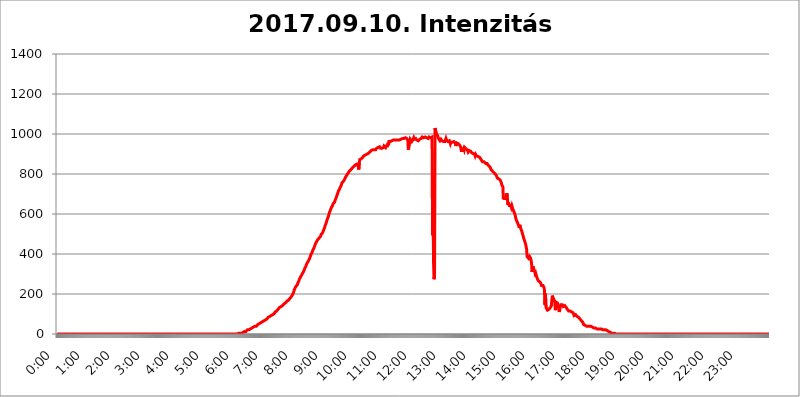
| Category | 2017.09.10. Intenzitás [W/m^2] |
|---|---|
| 0.0 | 0 |
| 0.0006944444444444445 | 0 |
| 0.001388888888888889 | 0 |
| 0.0020833333333333333 | 0 |
| 0.002777777777777778 | 0 |
| 0.003472222222222222 | 0 |
| 0.004166666666666667 | 0 |
| 0.004861111111111111 | 0 |
| 0.005555555555555556 | 0 |
| 0.0062499999999999995 | 0 |
| 0.006944444444444444 | 0 |
| 0.007638888888888889 | 0 |
| 0.008333333333333333 | 0 |
| 0.009027777777777779 | 0 |
| 0.009722222222222222 | 0 |
| 0.010416666666666666 | 0 |
| 0.011111111111111112 | 0 |
| 0.011805555555555555 | 0 |
| 0.012499999999999999 | 0 |
| 0.013194444444444444 | 0 |
| 0.013888888888888888 | 0 |
| 0.014583333333333332 | 0 |
| 0.015277777777777777 | 0 |
| 0.015972222222222224 | 0 |
| 0.016666666666666666 | 0 |
| 0.017361111111111112 | 0 |
| 0.018055555555555557 | 0 |
| 0.01875 | 0 |
| 0.019444444444444445 | 0 |
| 0.02013888888888889 | 0 |
| 0.020833333333333332 | 0 |
| 0.02152777777777778 | 0 |
| 0.022222222222222223 | 0 |
| 0.02291666666666667 | 0 |
| 0.02361111111111111 | 0 |
| 0.024305555555555556 | 0 |
| 0.024999999999999998 | 0 |
| 0.025694444444444447 | 0 |
| 0.02638888888888889 | 0 |
| 0.027083333333333334 | 0 |
| 0.027777777777777776 | 0 |
| 0.02847222222222222 | 0 |
| 0.029166666666666664 | 0 |
| 0.029861111111111113 | 0 |
| 0.030555555555555555 | 0 |
| 0.03125 | 0 |
| 0.03194444444444445 | 0 |
| 0.03263888888888889 | 0 |
| 0.03333333333333333 | 0 |
| 0.034027777777777775 | 0 |
| 0.034722222222222224 | 0 |
| 0.035416666666666666 | 0 |
| 0.036111111111111115 | 0 |
| 0.03680555555555556 | 0 |
| 0.0375 | 0 |
| 0.03819444444444444 | 0 |
| 0.03888888888888889 | 0 |
| 0.03958333333333333 | 0 |
| 0.04027777777777778 | 0 |
| 0.04097222222222222 | 0 |
| 0.041666666666666664 | 0 |
| 0.042361111111111106 | 0 |
| 0.04305555555555556 | 0 |
| 0.043750000000000004 | 0 |
| 0.044444444444444446 | 0 |
| 0.04513888888888889 | 0 |
| 0.04583333333333334 | 0 |
| 0.04652777777777778 | 0 |
| 0.04722222222222222 | 0 |
| 0.04791666666666666 | 0 |
| 0.04861111111111111 | 0 |
| 0.049305555555555554 | 0 |
| 0.049999999999999996 | 0 |
| 0.05069444444444445 | 0 |
| 0.051388888888888894 | 0 |
| 0.052083333333333336 | 0 |
| 0.05277777777777778 | 0 |
| 0.05347222222222222 | 0 |
| 0.05416666666666667 | 0 |
| 0.05486111111111111 | 0 |
| 0.05555555555555555 | 0 |
| 0.05625 | 0 |
| 0.05694444444444444 | 0 |
| 0.057638888888888885 | 0 |
| 0.05833333333333333 | 0 |
| 0.05902777777777778 | 0 |
| 0.059722222222222225 | 0 |
| 0.06041666666666667 | 0 |
| 0.061111111111111116 | 0 |
| 0.06180555555555556 | 0 |
| 0.0625 | 0 |
| 0.06319444444444444 | 0 |
| 0.06388888888888888 | 0 |
| 0.06458333333333334 | 0 |
| 0.06527777777777778 | 0 |
| 0.06597222222222222 | 0 |
| 0.06666666666666667 | 0 |
| 0.06736111111111111 | 0 |
| 0.06805555555555555 | 0 |
| 0.06874999999999999 | 0 |
| 0.06944444444444443 | 0 |
| 0.07013888888888889 | 0 |
| 0.07083333333333333 | 0 |
| 0.07152777777777779 | 0 |
| 0.07222222222222223 | 0 |
| 0.07291666666666667 | 0 |
| 0.07361111111111111 | 0 |
| 0.07430555555555556 | 0 |
| 0.075 | 0 |
| 0.07569444444444444 | 0 |
| 0.0763888888888889 | 0 |
| 0.07708333333333334 | 0 |
| 0.07777777777777778 | 0 |
| 0.07847222222222222 | 0 |
| 0.07916666666666666 | 0 |
| 0.0798611111111111 | 0 |
| 0.08055555555555556 | 0 |
| 0.08125 | 0 |
| 0.08194444444444444 | 0 |
| 0.08263888888888889 | 0 |
| 0.08333333333333333 | 0 |
| 0.08402777777777777 | 0 |
| 0.08472222222222221 | 0 |
| 0.08541666666666665 | 0 |
| 0.08611111111111112 | 0 |
| 0.08680555555555557 | 0 |
| 0.08750000000000001 | 0 |
| 0.08819444444444445 | 0 |
| 0.08888888888888889 | 0 |
| 0.08958333333333333 | 0 |
| 0.09027777777777778 | 0 |
| 0.09097222222222222 | 0 |
| 0.09166666666666667 | 0 |
| 0.09236111111111112 | 0 |
| 0.09305555555555556 | 0 |
| 0.09375 | 0 |
| 0.09444444444444444 | 0 |
| 0.09513888888888888 | 0 |
| 0.09583333333333333 | 0 |
| 0.09652777777777777 | 0 |
| 0.09722222222222222 | 0 |
| 0.09791666666666667 | 0 |
| 0.09861111111111111 | 0 |
| 0.09930555555555555 | 0 |
| 0.09999999999999999 | 0 |
| 0.10069444444444443 | 0 |
| 0.1013888888888889 | 0 |
| 0.10208333333333335 | 0 |
| 0.10277777777777779 | 0 |
| 0.10347222222222223 | 0 |
| 0.10416666666666667 | 0 |
| 0.10486111111111111 | 0 |
| 0.10555555555555556 | 0 |
| 0.10625 | 0 |
| 0.10694444444444444 | 0 |
| 0.1076388888888889 | 0 |
| 0.10833333333333334 | 0 |
| 0.10902777777777778 | 0 |
| 0.10972222222222222 | 0 |
| 0.1111111111111111 | 0 |
| 0.11180555555555556 | 0 |
| 0.11180555555555556 | 0 |
| 0.1125 | 0 |
| 0.11319444444444444 | 0 |
| 0.11388888888888889 | 0 |
| 0.11458333333333333 | 0 |
| 0.11527777777777777 | 0 |
| 0.11597222222222221 | 0 |
| 0.11666666666666665 | 0 |
| 0.1173611111111111 | 0 |
| 0.11805555555555557 | 0 |
| 0.11944444444444445 | 0 |
| 0.12013888888888889 | 0 |
| 0.12083333333333333 | 0 |
| 0.12152777777777778 | 0 |
| 0.12222222222222223 | 0 |
| 0.12291666666666667 | 0 |
| 0.12291666666666667 | 0 |
| 0.12361111111111112 | 0 |
| 0.12430555555555556 | 0 |
| 0.125 | 0 |
| 0.12569444444444444 | 0 |
| 0.12638888888888888 | 0 |
| 0.12708333333333333 | 0 |
| 0.16875 | 0 |
| 0.12847222222222224 | 0 |
| 0.12916666666666668 | 0 |
| 0.12986111111111112 | 0 |
| 0.13055555555555556 | 0 |
| 0.13125 | 0 |
| 0.13194444444444445 | 0 |
| 0.1326388888888889 | 0 |
| 0.13333333333333333 | 0 |
| 0.13402777777777777 | 0 |
| 0.13402777777777777 | 0 |
| 0.13472222222222222 | 0 |
| 0.13541666666666666 | 0 |
| 0.1361111111111111 | 0 |
| 0.13749999999999998 | 0 |
| 0.13819444444444443 | 0 |
| 0.1388888888888889 | 0 |
| 0.13958333333333334 | 0 |
| 0.14027777777777778 | 0 |
| 0.14097222222222222 | 0 |
| 0.14166666666666666 | 0 |
| 0.1423611111111111 | 0 |
| 0.14305555555555557 | 0 |
| 0.14375000000000002 | 0 |
| 0.14444444444444446 | 0 |
| 0.1451388888888889 | 0 |
| 0.1451388888888889 | 0 |
| 0.14652777777777778 | 0 |
| 0.14722222222222223 | 0 |
| 0.14791666666666667 | 0 |
| 0.1486111111111111 | 0 |
| 0.14930555555555555 | 0 |
| 0.15 | 0 |
| 0.15069444444444444 | 0 |
| 0.15138888888888888 | 0 |
| 0.15208333333333332 | 0 |
| 0.15277777777777776 | 0 |
| 0.15347222222222223 | 0 |
| 0.15416666666666667 | 0 |
| 0.15486111111111112 | 0 |
| 0.15555555555555556 | 0 |
| 0.15625 | 0 |
| 0.15694444444444444 | 0 |
| 0.15763888888888888 | 0 |
| 0.15833333333333333 | 0 |
| 0.15902777777777777 | 0 |
| 0.15972222222222224 | 0 |
| 0.16041666666666668 | 0 |
| 0.16111111111111112 | 0 |
| 0.16180555555555556 | 0 |
| 0.1625 | 0 |
| 0.16319444444444445 | 0 |
| 0.1638888888888889 | 0 |
| 0.16458333333333333 | 0 |
| 0.16527777777777777 | 0 |
| 0.16597222222222222 | 0 |
| 0.16666666666666666 | 0 |
| 0.1673611111111111 | 0 |
| 0.16805555555555554 | 0 |
| 0.16874999999999998 | 0 |
| 0.16944444444444443 | 0 |
| 0.17013888888888887 | 0 |
| 0.1708333333333333 | 0 |
| 0.17152777777777775 | 0 |
| 0.17222222222222225 | 0 |
| 0.1729166666666667 | 0 |
| 0.17361111111111113 | 0 |
| 0.17430555555555557 | 0 |
| 0.17500000000000002 | 0 |
| 0.17569444444444446 | 0 |
| 0.1763888888888889 | 0 |
| 0.17708333333333334 | 0 |
| 0.17777777777777778 | 0 |
| 0.17847222222222223 | 0 |
| 0.17916666666666667 | 0 |
| 0.1798611111111111 | 0 |
| 0.18055555555555555 | 0 |
| 0.18125 | 0 |
| 0.18194444444444444 | 0 |
| 0.1826388888888889 | 0 |
| 0.18333333333333335 | 0 |
| 0.1840277777777778 | 0 |
| 0.18472222222222223 | 0 |
| 0.18541666666666667 | 0 |
| 0.18611111111111112 | 0 |
| 0.18680555555555556 | 0 |
| 0.1875 | 0 |
| 0.18819444444444444 | 0 |
| 0.18888888888888888 | 0 |
| 0.18958333333333333 | 0 |
| 0.19027777777777777 | 0 |
| 0.1909722222222222 | 0 |
| 0.19166666666666665 | 0 |
| 0.19236111111111112 | 0 |
| 0.19305555555555554 | 0 |
| 0.19375 | 0 |
| 0.19444444444444445 | 0 |
| 0.1951388888888889 | 0 |
| 0.19583333333333333 | 0 |
| 0.19652777777777777 | 0 |
| 0.19722222222222222 | 0 |
| 0.19791666666666666 | 0 |
| 0.1986111111111111 | 0 |
| 0.19930555555555554 | 0 |
| 0.19999999999999998 | 0 |
| 0.20069444444444443 | 0 |
| 0.20138888888888887 | 0 |
| 0.2020833333333333 | 0 |
| 0.2027777777777778 | 0 |
| 0.2034722222222222 | 0 |
| 0.2041666666666667 | 0 |
| 0.20486111111111113 | 0 |
| 0.20555555555555557 | 0 |
| 0.20625000000000002 | 0 |
| 0.20694444444444446 | 0 |
| 0.2076388888888889 | 0 |
| 0.20833333333333334 | 0 |
| 0.20902777777777778 | 0 |
| 0.20972222222222223 | 0 |
| 0.21041666666666667 | 0 |
| 0.2111111111111111 | 0 |
| 0.21180555555555555 | 0 |
| 0.2125 | 0 |
| 0.21319444444444444 | 0 |
| 0.2138888888888889 | 0 |
| 0.21458333333333335 | 0 |
| 0.2152777777777778 | 0 |
| 0.21597222222222223 | 0 |
| 0.21666666666666667 | 0 |
| 0.21736111111111112 | 0 |
| 0.21805555555555556 | 0 |
| 0.21875 | 0 |
| 0.21944444444444444 | 0 |
| 0.22013888888888888 | 0 |
| 0.22083333333333333 | 0 |
| 0.22152777777777777 | 0 |
| 0.2222222222222222 | 0 |
| 0.22291666666666665 | 0 |
| 0.2236111111111111 | 0 |
| 0.22430555555555556 | 0 |
| 0.225 | 0 |
| 0.22569444444444445 | 0 |
| 0.2263888888888889 | 0 |
| 0.22708333333333333 | 0 |
| 0.22777777777777777 | 0 |
| 0.22847222222222222 | 0 |
| 0.22916666666666666 | 0 |
| 0.2298611111111111 | 0 |
| 0.23055555555555554 | 0 |
| 0.23124999999999998 | 0 |
| 0.23194444444444443 | 0 |
| 0.23263888888888887 | 0 |
| 0.2333333333333333 | 0 |
| 0.2340277777777778 | 0 |
| 0.2347222222222222 | 0 |
| 0.2354166666666667 | 0 |
| 0.23611111111111113 | 0 |
| 0.23680555555555557 | 0 |
| 0.23750000000000002 | 0 |
| 0.23819444444444446 | 0 |
| 0.2388888888888889 | 0 |
| 0.23958333333333334 | 0 |
| 0.24027777777777778 | 0 |
| 0.24097222222222223 | 0 |
| 0.24166666666666667 | 0 |
| 0.2423611111111111 | 0 |
| 0.24305555555555555 | 0 |
| 0.24375 | 0 |
| 0.24444444444444446 | 0 |
| 0.24513888888888888 | 0 |
| 0.24583333333333335 | 0 |
| 0.2465277777777778 | 0 |
| 0.24722222222222223 | 0 |
| 0.24791666666666667 | 0 |
| 0.24861111111111112 | 0 |
| 0.24930555555555556 | 0 |
| 0.25 | 0 |
| 0.25069444444444444 | 0 |
| 0.2513888888888889 | 0 |
| 0.2520833333333333 | 0 |
| 0.25277777777777777 | 0 |
| 0.2534722222222222 | 0 |
| 0.25416666666666665 | 3.525 |
| 0.2548611111111111 | 3.525 |
| 0.2555555555555556 | 3.525 |
| 0.25625000000000003 | 3.525 |
| 0.2569444444444445 | 3.525 |
| 0.2576388888888889 | 3.525 |
| 0.25833333333333336 | 3.525 |
| 0.2590277777777778 | 7.887 |
| 0.25972222222222224 | 7.887 |
| 0.2604166666666667 | 7.887 |
| 0.2611111111111111 | 7.887 |
| 0.26180555555555557 | 12.257 |
| 0.2625 | 12.257 |
| 0.26319444444444445 | 12.257 |
| 0.2638888888888889 | 12.257 |
| 0.26458333333333334 | 12.257 |
| 0.2652777777777778 | 16.636 |
| 0.2659722222222222 | 16.636 |
| 0.26666666666666666 | 21.024 |
| 0.2673611111111111 | 21.024 |
| 0.26805555555555555 | 21.024 |
| 0.26875 | 21.024 |
| 0.26944444444444443 | 25.419 |
| 0.2701388888888889 | 25.419 |
| 0.2708333333333333 | 25.419 |
| 0.27152777777777776 | 29.823 |
| 0.2722222222222222 | 29.823 |
| 0.27291666666666664 | 29.823 |
| 0.2736111111111111 | 29.823 |
| 0.2743055555555555 | 34.234 |
| 0.27499999999999997 | 34.234 |
| 0.27569444444444446 | 34.234 |
| 0.27638888888888885 | 38.653 |
| 0.27708333333333335 | 38.653 |
| 0.2777777777777778 | 38.653 |
| 0.27847222222222223 | 38.653 |
| 0.2791666666666667 | 38.653 |
| 0.2798611111111111 | 43.079 |
| 0.28055555555555556 | 43.079 |
| 0.28125 | 47.511 |
| 0.28194444444444444 | 47.511 |
| 0.2826388888888889 | 47.511 |
| 0.2833333333333333 | 51.951 |
| 0.28402777777777777 | 51.951 |
| 0.2847222222222222 | 51.951 |
| 0.28541666666666665 | 56.398 |
| 0.28611111111111115 | 56.398 |
| 0.28680555555555554 | 56.398 |
| 0.28750000000000003 | 60.85 |
| 0.2881944444444445 | 60.85 |
| 0.2888888888888889 | 60.85 |
| 0.28958333333333336 | 65.31 |
| 0.2902777777777778 | 65.31 |
| 0.29097222222222224 | 69.775 |
| 0.2916666666666667 | 69.775 |
| 0.2923611111111111 | 74.246 |
| 0.29305555555555557 | 74.246 |
| 0.29375 | 74.246 |
| 0.29444444444444445 | 78.722 |
| 0.2951388888888889 | 78.722 |
| 0.29583333333333334 | 83.205 |
| 0.2965277777777778 | 83.205 |
| 0.2972222222222222 | 83.205 |
| 0.29791666666666666 | 87.692 |
| 0.2986111111111111 | 87.692 |
| 0.29930555555555555 | 92.184 |
| 0.3 | 92.184 |
| 0.30069444444444443 | 92.184 |
| 0.3013888888888889 | 96.682 |
| 0.3020833333333333 | 96.682 |
| 0.30277777777777776 | 101.184 |
| 0.3034722222222222 | 101.184 |
| 0.30416666666666664 | 101.184 |
| 0.3048611111111111 | 105.69 |
| 0.3055555555555555 | 110.201 |
| 0.30624999999999997 | 110.201 |
| 0.3069444444444444 | 114.716 |
| 0.3076388888888889 | 114.716 |
| 0.30833333333333335 | 119.235 |
| 0.3090277777777778 | 119.235 |
| 0.30972222222222223 | 123.758 |
| 0.3104166666666667 | 123.758 |
| 0.3111111111111111 | 128.284 |
| 0.31180555555555556 | 132.814 |
| 0.3125 | 132.814 |
| 0.31319444444444444 | 137.347 |
| 0.3138888888888889 | 137.347 |
| 0.3145833333333333 | 137.347 |
| 0.31527777777777777 | 141.884 |
| 0.3159722222222222 | 141.884 |
| 0.31666666666666665 | 146.423 |
| 0.31736111111111115 | 146.423 |
| 0.31805555555555554 | 150.964 |
| 0.31875000000000003 | 150.964 |
| 0.3194444444444445 | 155.509 |
| 0.3201388888888889 | 155.509 |
| 0.32083333333333336 | 160.056 |
| 0.3215277777777778 | 160.056 |
| 0.32222222222222224 | 164.605 |
| 0.3229166666666667 | 164.605 |
| 0.3236111111111111 | 164.605 |
| 0.32430555555555557 | 169.156 |
| 0.325 | 173.709 |
| 0.32569444444444445 | 173.709 |
| 0.3263888888888889 | 178.264 |
| 0.32708333333333334 | 182.82 |
| 0.3277777777777778 | 182.82 |
| 0.3284722222222222 | 187.378 |
| 0.32916666666666666 | 191.937 |
| 0.3298611111111111 | 196.497 |
| 0.33055555555555555 | 201.058 |
| 0.33125 | 205.62 |
| 0.33194444444444443 | 214.746 |
| 0.3326388888888889 | 219.309 |
| 0.3333333333333333 | 228.436 |
| 0.3340277777777778 | 233 |
| 0.3347222222222222 | 237.564 |
| 0.3354166666666667 | 242.127 |
| 0.3361111111111111 | 242.127 |
| 0.3368055555555556 | 246.689 |
| 0.33749999999999997 | 255.813 |
| 0.33819444444444446 | 260.373 |
| 0.33888888888888885 | 264.932 |
| 0.33958333333333335 | 274.047 |
| 0.34027777777777773 | 278.603 |
| 0.34097222222222223 | 283.156 |
| 0.3416666666666666 | 287.709 |
| 0.3423611111111111 | 287.709 |
| 0.3430555555555555 | 296.808 |
| 0.34375 | 296.808 |
| 0.3444444444444445 | 305.898 |
| 0.3451388888888889 | 310.44 |
| 0.3458333333333334 | 314.98 |
| 0.34652777777777777 | 319.517 |
| 0.34722222222222227 | 328.584 |
| 0.34791666666666665 | 333.113 |
| 0.34861111111111115 | 337.639 |
| 0.34930555555555554 | 346.682 |
| 0.35000000000000003 | 351.198 |
| 0.3506944444444444 | 355.712 |
| 0.3513888888888889 | 360.221 |
| 0.3520833333333333 | 364.728 |
| 0.3527777777777778 | 369.23 |
| 0.3534722222222222 | 373.729 |
| 0.3541666666666667 | 378.224 |
| 0.3548611111111111 | 387.202 |
| 0.35555555555555557 | 391.685 |
| 0.35625 | 400.638 |
| 0.35694444444444445 | 405.108 |
| 0.3576388888888889 | 409.574 |
| 0.35833333333333334 | 418.492 |
| 0.3590277777777778 | 422.943 |
| 0.3597222222222222 | 427.39 |
| 0.36041666666666666 | 431.833 |
| 0.3611111111111111 | 440.702 |
| 0.36180555555555555 | 445.129 |
| 0.3625 | 453.968 |
| 0.36319444444444443 | 458.38 |
| 0.3638888888888889 | 462.786 |
| 0.3645833333333333 | 467.187 |
| 0.3652777777777778 | 471.582 |
| 0.3659722222222222 | 475.972 |
| 0.3666666666666667 | 475.972 |
| 0.3673611111111111 | 480.356 |
| 0.3680555555555556 | 484.735 |
| 0.36874999999999997 | 484.735 |
| 0.36944444444444446 | 489.108 |
| 0.37013888888888885 | 497.836 |
| 0.37083333333333335 | 497.836 |
| 0.37152777777777773 | 502.192 |
| 0.37222222222222223 | 506.542 |
| 0.3729166666666666 | 510.885 |
| 0.3736111111111111 | 519.555 |
| 0.3743055555555555 | 523.88 |
| 0.375 | 532.513 |
| 0.3756944444444445 | 541.121 |
| 0.3763888888888889 | 545.416 |
| 0.3770833333333334 | 553.986 |
| 0.37777777777777777 | 562.53 |
| 0.37847222222222227 | 571.049 |
| 0.37916666666666665 | 575.299 |
| 0.37986111111111115 | 583.779 |
| 0.38055555555555554 | 592.233 |
| 0.38125000000000003 | 600.661 |
| 0.3819444444444444 | 609.062 |
| 0.3826388888888889 | 613.252 |
| 0.3833333333333333 | 621.613 |
| 0.3840277777777778 | 625.784 |
| 0.3847222222222222 | 634.105 |
| 0.3854166666666667 | 638.256 |
| 0.3861111111111111 | 642.4 |
| 0.38680555555555557 | 650.667 |
| 0.3875 | 650.667 |
| 0.38819444444444445 | 654.791 |
| 0.3888888888888889 | 658.909 |
| 0.38958333333333334 | 667.123 |
| 0.3902777777777778 | 671.22 |
| 0.3909722222222222 | 679.395 |
| 0.39166666666666666 | 687.544 |
| 0.3923611111111111 | 687.544 |
| 0.39305555555555555 | 699.717 |
| 0.39375 | 707.8 |
| 0.39444444444444443 | 715.858 |
| 0.3951388888888889 | 719.877 |
| 0.3958333333333333 | 723.889 |
| 0.3965277777777778 | 731.896 |
| 0.3972222222222222 | 735.89 |
| 0.3979166666666667 | 739.877 |
| 0.3986111111111111 | 747.834 |
| 0.3993055555555556 | 755.766 |
| 0.39999999999999997 | 759.723 |
| 0.40069444444444446 | 759.723 |
| 0.40138888888888885 | 763.674 |
| 0.40208333333333335 | 767.62 |
| 0.40277777777777773 | 771.559 |
| 0.40347222222222223 | 775.492 |
| 0.4041666666666666 | 783.342 |
| 0.4048611111111111 | 787.258 |
| 0.4055555555555555 | 791.169 |
| 0.40625 | 795.074 |
| 0.4069444444444445 | 798.974 |
| 0.4076388888888889 | 802.868 |
| 0.4083333333333334 | 806.757 |
| 0.40902777777777777 | 810.641 |
| 0.40972222222222227 | 814.519 |
| 0.41041666666666665 | 818.392 |
| 0.41111111111111115 | 818.392 |
| 0.41180555555555554 | 822.26 |
| 0.41250000000000003 | 822.26 |
| 0.4131944444444444 | 826.123 |
| 0.4138888888888889 | 829.981 |
| 0.4145833333333333 | 829.981 |
| 0.4152777777777778 | 829.981 |
| 0.4159722222222222 | 837.682 |
| 0.4166666666666667 | 841.526 |
| 0.4173611111111111 | 841.526 |
| 0.41805555555555557 | 845.365 |
| 0.41875 | 845.365 |
| 0.41944444444444445 | 845.365 |
| 0.4201388888888889 | 849.199 |
| 0.42083333333333334 | 853.029 |
| 0.4215277777777778 | 853.029 |
| 0.4222222222222222 | 837.682 |
| 0.42291666666666666 | 822.26 |
| 0.4236111111111111 | 856.855 |
| 0.42430555555555555 | 872.114 |
| 0.425 | 872.114 |
| 0.42569444444444443 | 872.114 |
| 0.4263888888888889 | 875.918 |
| 0.4270833333333333 | 879.719 |
| 0.4277777777777778 | 879.719 |
| 0.4284722222222222 | 883.516 |
| 0.4291666666666667 | 887.309 |
| 0.4298611111111111 | 891.099 |
| 0.4305555555555556 | 891.099 |
| 0.43124999999999997 | 894.885 |
| 0.43194444444444446 | 894.885 |
| 0.43263888888888885 | 894.885 |
| 0.43333333333333335 | 898.668 |
| 0.43402777777777773 | 898.668 |
| 0.43472222222222223 | 902.447 |
| 0.4354166666666666 | 902.447 |
| 0.4361111111111111 | 902.447 |
| 0.4368055555555555 | 906.223 |
| 0.4375 | 906.223 |
| 0.4381944444444445 | 909.996 |
| 0.4388888888888889 | 909.996 |
| 0.4395833333333334 | 913.766 |
| 0.44027777777777777 | 917.534 |
| 0.44097222222222227 | 917.534 |
| 0.44166666666666665 | 921.298 |
| 0.44236111111111115 | 921.298 |
| 0.44305555555555554 | 921.298 |
| 0.44375000000000003 | 921.298 |
| 0.4444444444444444 | 921.298 |
| 0.4451388888888889 | 925.06 |
| 0.4458333333333333 | 921.298 |
| 0.4465277777777778 | 921.298 |
| 0.4472222222222222 | 925.06 |
| 0.4479166666666667 | 928.819 |
| 0.4486111111111111 | 932.576 |
| 0.44930555555555557 | 932.576 |
| 0.45 | 932.576 |
| 0.45069444444444445 | 936.33 |
| 0.4513888888888889 | 936.33 |
| 0.45208333333333334 | 936.33 |
| 0.4527777777777778 | 936.33 |
| 0.4534722222222222 | 928.819 |
| 0.45416666666666666 | 925.06 |
| 0.4548611111111111 | 928.819 |
| 0.45555555555555555 | 928.819 |
| 0.45625 | 925.06 |
| 0.45694444444444443 | 925.06 |
| 0.4576388888888889 | 932.576 |
| 0.4583333333333333 | 940.082 |
| 0.4590277777777778 | 940.082 |
| 0.4597222222222222 | 940.082 |
| 0.4604166666666667 | 932.576 |
| 0.4611111111111111 | 940.082 |
| 0.4618055555555556 | 936.33 |
| 0.46249999999999997 | 940.082 |
| 0.46319444444444446 | 940.082 |
| 0.46388888888888885 | 955.071 |
| 0.46458333333333335 | 943.832 |
| 0.46527777777777773 | 962.555 |
| 0.46597222222222223 | 966.295 |
| 0.4666666666666666 | 962.555 |
| 0.4673611111111111 | 962.555 |
| 0.4680555555555555 | 962.555 |
| 0.46875 | 966.295 |
| 0.4694444444444445 | 966.295 |
| 0.4701388888888889 | 970.034 |
| 0.4708333333333334 | 970.034 |
| 0.47152777777777777 | 970.034 |
| 0.47222222222222227 | 970.034 |
| 0.47291666666666665 | 970.034 |
| 0.47361111111111115 | 970.034 |
| 0.47430555555555554 | 966.295 |
| 0.47500000000000003 | 966.295 |
| 0.4756944444444444 | 970.034 |
| 0.4763888888888889 | 970.034 |
| 0.4770833333333333 | 970.034 |
| 0.4777777777777778 | 970.034 |
| 0.4784722222222222 | 966.295 |
| 0.4791666666666667 | 966.295 |
| 0.4798611111111111 | 970.034 |
| 0.48055555555555557 | 970.034 |
| 0.48125 | 973.772 |
| 0.48194444444444445 | 973.772 |
| 0.4826388888888889 | 977.508 |
| 0.48333333333333334 | 977.508 |
| 0.4840277777777778 | 977.508 |
| 0.4847222222222222 | 977.508 |
| 0.48541666666666666 | 973.772 |
| 0.4861111111111111 | 977.508 |
| 0.48680555555555555 | 977.508 |
| 0.4875 | 977.508 |
| 0.48819444444444443 | 981.244 |
| 0.4888888888888889 | 981.244 |
| 0.4895833333333333 | 977.508 |
| 0.4902777777777778 | 977.508 |
| 0.4909722222222222 | 977.508 |
| 0.4916666666666667 | 970.034 |
| 0.4923611111111111 | 921.298 |
| 0.4930555555555556 | 932.576 |
| 0.49374999999999997 | 936.33 |
| 0.49444444444444446 | 958.814 |
| 0.49513888888888885 | 973.772 |
| 0.49583333333333335 | 973.772 |
| 0.49652777777777773 | 973.772 |
| 0.49722222222222223 | 962.555 |
| 0.4979166666666666 | 966.295 |
| 0.4986111111111111 | 970.034 |
| 0.4993055555555555 | 970.034 |
| 0.5 | 981.244 |
| 0.5006944444444444 | 973.772 |
| 0.5013888888888889 | 973.772 |
| 0.5020833333333333 | 977.508 |
| 0.5027777777777778 | 977.508 |
| 0.5034722222222222 | 977.508 |
| 0.5041666666666667 | 970.034 |
| 0.5048611111111111 | 970.034 |
| 0.5055555555555555 | 970.034 |
| 0.50625 | 966.295 |
| 0.5069444444444444 | 966.295 |
| 0.5076388888888889 | 970.034 |
| 0.5083333333333333 | 973.772 |
| 0.5090277777777777 | 973.772 |
| 0.5097222222222222 | 973.772 |
| 0.5104166666666666 | 977.508 |
| 0.5111111111111112 | 977.508 |
| 0.5118055555555555 | 984.98 |
| 0.5125000000000001 | 981.244 |
| 0.5131944444444444 | 984.98 |
| 0.513888888888889 | 981.244 |
| 0.5145833333333333 | 984.98 |
| 0.5152777777777778 | 984.98 |
| 0.5159722222222222 | 984.98 |
| 0.5166666666666667 | 984.98 |
| 0.517361111111111 | 981.244 |
| 0.5180555555555556 | 981.244 |
| 0.5187499999999999 | 981.244 |
| 0.5194444444444445 | 977.508 |
| 0.5201388888888888 | 977.508 |
| 0.5208333333333334 | 981.244 |
| 0.5215277777777778 | 984.98 |
| 0.5222222222222223 | 984.98 |
| 0.5229166666666667 | 984.98 |
| 0.5236111111111111 | 981.244 |
| 0.5243055555555556 | 977.508 |
| 0.525 | 981.244 |
| 0.5256944444444445 | 984.98 |
| 0.5263888888888889 | 493.475 |
| 0.5270833333333333 | 791.169 |
| 0.5277777777777778 | 355.712 |
| 0.5284722222222222 | 274.047 |
| 0.5291666666666667 | 292.259 |
| 0.5298611111111111 | 1029.798 |
| 0.5305555555555556 | 1026.06 |
| 0.53125 | 1007.383 |
| 0.5319444444444444 | 999.916 |
| 0.5326388888888889 | 996.182 |
| 0.5333333333333333 | 992.448 |
| 0.5340277777777778 | 984.98 |
| 0.5347222222222222 | 977.508 |
| 0.5354166666666667 | 977.508 |
| 0.5361111111111111 | 973.772 |
| 0.5368055555555555 | 966.295 |
| 0.5375 | 970.034 |
| 0.5381944444444444 | 973.772 |
| 0.5388888888888889 | 970.034 |
| 0.5395833333333333 | 966.295 |
| 0.5402777777777777 | 970.034 |
| 0.5409722222222222 | 966.295 |
| 0.5416666666666666 | 962.555 |
| 0.5423611111111112 | 962.555 |
| 0.5430555555555555 | 966.295 |
| 0.5437500000000001 | 962.555 |
| 0.5444444444444444 | 970.034 |
| 0.545138888888889 | 977.508 |
| 0.5458333333333333 | 970.034 |
| 0.5465277777777778 | 970.034 |
| 0.5472222222222222 | 966.295 |
| 0.5479166666666667 | 962.555 |
| 0.548611111111111 | 962.555 |
| 0.5493055555555556 | 966.295 |
| 0.5499999999999999 | 966.295 |
| 0.5506944444444445 | 966.295 |
| 0.5513888888888888 | 951.327 |
| 0.5520833333333334 | 958.814 |
| 0.5527777777777778 | 958.814 |
| 0.5534722222222223 | 958.814 |
| 0.5541666666666667 | 958.814 |
| 0.5548611111111111 | 958.814 |
| 0.5555555555555556 | 958.814 |
| 0.55625 | 962.555 |
| 0.5569444444444445 | 958.814 |
| 0.5576388888888889 | 958.814 |
| 0.5583333333333333 | 955.071 |
| 0.5590277777777778 | 940.082 |
| 0.5597222222222222 | 947.58 |
| 0.5604166666666667 | 955.071 |
| 0.5611111111111111 | 955.071 |
| 0.5618055555555556 | 951.327 |
| 0.5625 | 951.327 |
| 0.5631944444444444 | 947.58 |
| 0.5638888888888889 | 947.58 |
| 0.5645833333333333 | 943.832 |
| 0.5652777777777778 | 940.082 |
| 0.5659722222222222 | 932.576 |
| 0.5666666666666667 | 917.534 |
| 0.5673611111111111 | 921.298 |
| 0.5680555555555555 | 921.298 |
| 0.56875 | 917.534 |
| 0.5694444444444444 | 921.298 |
| 0.5701388888888889 | 928.819 |
| 0.5708333333333333 | 921.298 |
| 0.5715277777777777 | 932.576 |
| 0.5722222222222222 | 932.576 |
| 0.5729166666666666 | 932.576 |
| 0.5736111111111112 | 925.06 |
| 0.5743055555555555 | 925.06 |
| 0.5750000000000001 | 921.298 |
| 0.5756944444444444 | 917.534 |
| 0.576388888888889 | 909.996 |
| 0.5770833333333333 | 909.996 |
| 0.5777777777777778 | 917.534 |
| 0.5784722222222222 | 913.766 |
| 0.5791666666666667 | 913.766 |
| 0.579861111111111 | 913.766 |
| 0.5805555555555556 | 909.996 |
| 0.5812499999999999 | 906.223 |
| 0.5819444444444445 | 906.223 |
| 0.5826388888888888 | 902.447 |
| 0.5833333333333334 | 902.447 |
| 0.5840277777777778 | 902.447 |
| 0.5847222222222223 | 898.668 |
| 0.5854166666666667 | 898.668 |
| 0.5861111111111111 | 891.099 |
| 0.5868055555555556 | 898.668 |
| 0.5875 | 894.885 |
| 0.5881944444444445 | 891.099 |
| 0.5888888888888889 | 894.885 |
| 0.5895833333333333 | 891.099 |
| 0.5902777777777778 | 887.309 |
| 0.5909722222222222 | 887.309 |
| 0.5916666666666667 | 883.516 |
| 0.5923611111111111 | 883.516 |
| 0.5930555555555556 | 879.719 |
| 0.59375 | 875.918 |
| 0.5944444444444444 | 872.114 |
| 0.5951388888888889 | 868.305 |
| 0.5958333333333333 | 868.305 |
| 0.5965277777777778 | 860.676 |
| 0.5972222222222222 | 856.855 |
| 0.5979166666666667 | 860.676 |
| 0.5986111111111111 | 860.676 |
| 0.5993055555555555 | 856.855 |
| 0.6 | 856.855 |
| 0.6006944444444444 | 853.029 |
| 0.6013888888888889 | 853.029 |
| 0.6020833333333333 | 853.029 |
| 0.6027777777777777 | 853.029 |
| 0.6034722222222222 | 849.199 |
| 0.6041666666666666 | 845.365 |
| 0.6048611111111112 | 841.526 |
| 0.6055555555555555 | 841.526 |
| 0.6062500000000001 | 837.682 |
| 0.6069444444444444 | 833.834 |
| 0.607638888888889 | 829.981 |
| 0.6083333333333333 | 822.26 |
| 0.6090277777777778 | 822.26 |
| 0.6097222222222222 | 818.392 |
| 0.6104166666666667 | 814.519 |
| 0.611111111111111 | 814.519 |
| 0.6118055555555556 | 810.641 |
| 0.6124999999999999 | 806.757 |
| 0.6131944444444445 | 806.757 |
| 0.6138888888888888 | 802.868 |
| 0.6145833333333334 | 798.974 |
| 0.6152777777777778 | 795.074 |
| 0.6159722222222223 | 791.169 |
| 0.6166666666666667 | 791.169 |
| 0.6173611111111111 | 779.42 |
| 0.6180555555555556 | 783.342 |
| 0.61875 | 779.42 |
| 0.6194444444444445 | 775.492 |
| 0.6201388888888889 | 775.492 |
| 0.6208333333333333 | 771.559 |
| 0.6215277777777778 | 767.62 |
| 0.6222222222222222 | 763.674 |
| 0.6229166666666667 | 755.766 |
| 0.6236111111111111 | 743.859 |
| 0.6243055555555556 | 739.877 |
| 0.625 | 735.89 |
| 0.6256944444444444 | 675.311 |
| 0.6263888888888889 | 683.473 |
| 0.6270833333333333 | 671.22 |
| 0.6277777777777778 | 679.395 |
| 0.6284722222222222 | 675.311 |
| 0.6291666666666667 | 675.311 |
| 0.6298611111111111 | 691.608 |
| 0.6305555555555555 | 703.762 |
| 0.63125 | 683.473 |
| 0.6319444444444444 | 646.537 |
| 0.6326388888888889 | 658.909 |
| 0.6333333333333333 | 650.667 |
| 0.6340277777777777 | 642.4 |
| 0.6347222222222222 | 642.4 |
| 0.6354166666666666 | 646.537 |
| 0.6361111111111112 | 642.4 |
| 0.6368055555555555 | 634.105 |
| 0.6375000000000001 | 642.4 |
| 0.6381944444444444 | 646.537 |
| 0.638888888888889 | 625.784 |
| 0.6395833333333333 | 621.613 |
| 0.6402777777777778 | 613.252 |
| 0.6409722222222222 | 609.062 |
| 0.6416666666666667 | 600.661 |
| 0.642361111111111 | 592.233 |
| 0.6430555555555556 | 579.542 |
| 0.6437499999999999 | 571.049 |
| 0.6444444444444445 | 571.049 |
| 0.6451388888888888 | 566.793 |
| 0.6458333333333334 | 553.986 |
| 0.6465277777777778 | 553.986 |
| 0.6472222222222223 | 541.121 |
| 0.6479166666666667 | 532.513 |
| 0.6486111111111111 | 545.416 |
| 0.6493055555555556 | 541.121 |
| 0.65 | 528.2 |
| 0.6506944444444445 | 523.88 |
| 0.6513888888888889 | 515.223 |
| 0.6520833333333333 | 510.885 |
| 0.6527777777777778 | 497.836 |
| 0.6534722222222222 | 493.475 |
| 0.6541666666666667 | 480.356 |
| 0.6548611111111111 | 471.582 |
| 0.6555555555555556 | 467.187 |
| 0.65625 | 467.187 |
| 0.6569444444444444 | 449.551 |
| 0.6576388888888889 | 436.27 |
| 0.6583333333333333 | 422.943 |
| 0.6590277777777778 | 387.202 |
| 0.6597222222222222 | 391.685 |
| 0.6604166666666667 | 387.202 |
| 0.6611111111111111 | 378.224 |
| 0.6618055555555555 | 382.715 |
| 0.6625 | 387.202 |
| 0.6631944444444444 | 382.715 |
| 0.6638888888888889 | 378.224 |
| 0.6645833333333333 | 369.23 |
| 0.6652777777777777 | 351.198 |
| 0.6659722222222222 | 310.44 |
| 0.6666666666666666 | 305.898 |
| 0.6673611111111111 | 337.639 |
| 0.6680555555555556 | 328.584 |
| 0.6687500000000001 | 328.584 |
| 0.6694444444444444 | 314.98 |
| 0.6701388888888888 | 305.898 |
| 0.6708333333333334 | 287.709 |
| 0.6715277777777778 | 296.808 |
| 0.6722222222222222 | 287.709 |
| 0.6729166666666666 | 283.156 |
| 0.6736111111111112 | 274.047 |
| 0.6743055555555556 | 269.49 |
| 0.6749999999999999 | 264.932 |
| 0.6756944444444444 | 264.932 |
| 0.6763888888888889 | 260.373 |
| 0.6770833333333334 | 260.373 |
| 0.6777777777777777 | 260.373 |
| 0.6784722222222223 | 251.251 |
| 0.6791666666666667 | 242.127 |
| 0.6798611111111111 | 242.127 |
| 0.6805555555555555 | 242.127 |
| 0.68125 | 242.127 |
| 0.6819444444444445 | 237.564 |
| 0.6826388888888889 | 233 |
| 0.6833333333333332 | 219.309 |
| 0.6840277777777778 | 146.423 |
| 0.6847222222222222 | 201.058 |
| 0.6854166666666667 | 137.347 |
| 0.686111111111111 | 128.284 |
| 0.6868055555555556 | 123.758 |
| 0.6875 | 119.235 |
| 0.6881944444444444 | 119.235 |
| 0.688888888888889 | 119.235 |
| 0.6895833333333333 | 123.758 |
| 0.6902777777777778 | 128.284 |
| 0.6909722222222222 | 128.284 |
| 0.6916666666666668 | 132.814 |
| 0.6923611111111111 | 137.347 |
| 0.6930555555555555 | 141.884 |
| 0.69375 | 173.709 |
| 0.6944444444444445 | 191.937 |
| 0.6951388888888889 | 182.82 |
| 0.6958333333333333 | 187.378 |
| 0.6965277777777777 | 173.709 |
| 0.6972222222222223 | 169.156 |
| 0.6979166666666666 | 155.509 |
| 0.6986111111111111 | 119.235 |
| 0.6993055555555556 | 160.056 |
| 0.7000000000000001 | 155.509 |
| 0.7006944444444444 | 155.509 |
| 0.7013888888888888 | 155.509 |
| 0.7020833333333334 | 146.423 |
| 0.7027777777777778 | 137.347 |
| 0.7034722222222222 | 119.235 |
| 0.7041666666666666 | 110.201 |
| 0.7048611111111112 | 123.758 |
| 0.7055555555555556 | 137.347 |
| 0.7062499999999999 | 146.423 |
| 0.7069444444444444 | 150.964 |
| 0.7076388888888889 | 150.964 |
| 0.7083333333333334 | 146.423 |
| 0.7090277777777777 | 141.884 |
| 0.7097222222222223 | 137.347 |
| 0.7104166666666667 | 141.884 |
| 0.7111111111111111 | 141.884 |
| 0.7118055555555555 | 141.884 |
| 0.7125 | 137.347 |
| 0.7131944444444445 | 137.347 |
| 0.7138888888888889 | 132.814 |
| 0.7145833333333332 | 132.814 |
| 0.7152777777777778 | 123.758 |
| 0.7159722222222222 | 123.758 |
| 0.7166666666666667 | 119.235 |
| 0.717361111111111 | 114.716 |
| 0.7180555555555556 | 114.716 |
| 0.71875 | 114.716 |
| 0.7194444444444444 | 114.716 |
| 0.720138888888889 | 114.716 |
| 0.7208333333333333 | 110.201 |
| 0.7215277777777778 | 110.201 |
| 0.7222222222222222 | 110.201 |
| 0.7229166666666668 | 105.69 |
| 0.7236111111111111 | 105.69 |
| 0.7243055555555555 | 101.184 |
| 0.725 | 92.184 |
| 0.7256944444444445 | 92.184 |
| 0.7263888888888889 | 96.682 |
| 0.7270833333333333 | 96.682 |
| 0.7277777777777777 | 92.184 |
| 0.7284722222222223 | 92.184 |
| 0.7291666666666666 | 87.692 |
| 0.7298611111111111 | 83.205 |
| 0.7305555555555556 | 83.205 |
| 0.7312500000000001 | 83.205 |
| 0.7319444444444444 | 83.205 |
| 0.7326388888888888 | 78.722 |
| 0.7333333333333334 | 74.246 |
| 0.7340277777777778 | 74.246 |
| 0.7347222222222222 | 69.775 |
| 0.7354166666666666 | 65.31 |
| 0.7361111111111112 | 65.31 |
| 0.7368055555555556 | 60.85 |
| 0.7374999999999999 | 56.398 |
| 0.7381944444444444 | 47.511 |
| 0.7388888888888889 | 47.511 |
| 0.7395833333333334 | 43.079 |
| 0.7402777777777777 | 43.079 |
| 0.7409722222222223 | 38.653 |
| 0.7416666666666667 | 38.653 |
| 0.7423611111111111 | 38.653 |
| 0.7430555555555555 | 38.653 |
| 0.74375 | 38.653 |
| 0.7444444444444445 | 38.653 |
| 0.7451388888888889 | 38.653 |
| 0.7458333333333332 | 38.653 |
| 0.7465277777777778 | 38.653 |
| 0.7472222222222222 | 38.653 |
| 0.7479166666666667 | 38.653 |
| 0.748611111111111 | 38.653 |
| 0.7493055555555556 | 34.234 |
| 0.75 | 34.234 |
| 0.7506944444444444 | 34.234 |
| 0.751388888888889 | 29.823 |
| 0.7520833333333333 | 29.823 |
| 0.7527777777777778 | 29.823 |
| 0.7534722222222222 | 29.823 |
| 0.7541666666666668 | 29.823 |
| 0.7548611111111111 | 29.823 |
| 0.7555555555555555 | 25.419 |
| 0.75625 | 29.823 |
| 0.7569444444444445 | 25.419 |
| 0.7576388888888889 | 25.419 |
| 0.7583333333333333 | 25.419 |
| 0.7590277777777777 | 25.419 |
| 0.7597222222222223 | 25.419 |
| 0.7604166666666666 | 25.419 |
| 0.7611111111111111 | 25.419 |
| 0.7618055555555556 | 25.419 |
| 0.7625000000000001 | 25.419 |
| 0.7631944444444444 | 25.419 |
| 0.7638888888888888 | 21.024 |
| 0.7645833333333334 | 21.024 |
| 0.7652777777777778 | 21.024 |
| 0.7659722222222222 | 21.024 |
| 0.7666666666666666 | 21.024 |
| 0.7673611111111112 | 21.024 |
| 0.7680555555555556 | 21.024 |
| 0.7687499999999999 | 21.024 |
| 0.7694444444444444 | 21.024 |
| 0.7701388888888889 | 16.636 |
| 0.7708333333333334 | 16.636 |
| 0.7715277777777777 | 16.636 |
| 0.7722222222222223 | 12.257 |
| 0.7729166666666667 | 12.257 |
| 0.7736111111111111 | 12.257 |
| 0.7743055555555555 | 12.257 |
| 0.775 | 7.887 |
| 0.7756944444444445 | 7.887 |
| 0.7763888888888889 | 7.887 |
| 0.7770833333333332 | 7.887 |
| 0.7777777777777778 | 3.525 |
| 0.7784722222222222 | 3.525 |
| 0.7791666666666667 | 3.525 |
| 0.779861111111111 | 3.525 |
| 0.7805555555555556 | 3.525 |
| 0.78125 | 3.525 |
| 0.7819444444444444 | 3.525 |
| 0.782638888888889 | 3.525 |
| 0.7833333333333333 | 0 |
| 0.7840277777777778 | 0 |
| 0.7847222222222222 | 0 |
| 0.7854166666666668 | 0 |
| 0.7861111111111111 | 0 |
| 0.7868055555555555 | 0 |
| 0.7875 | 0 |
| 0.7881944444444445 | 0 |
| 0.7888888888888889 | 0 |
| 0.7895833333333333 | 0 |
| 0.7902777777777777 | 0 |
| 0.7909722222222223 | 0 |
| 0.7916666666666666 | 0 |
| 0.7923611111111111 | 0 |
| 0.7930555555555556 | 0 |
| 0.7937500000000001 | 0 |
| 0.7944444444444444 | 0 |
| 0.7951388888888888 | 0 |
| 0.7958333333333334 | 0 |
| 0.7965277777777778 | 0 |
| 0.7972222222222222 | 0 |
| 0.7979166666666666 | 0 |
| 0.7986111111111112 | 0 |
| 0.7993055555555556 | 0 |
| 0.7999999999999999 | 0 |
| 0.8006944444444444 | 0 |
| 0.8013888888888889 | 0 |
| 0.8020833333333334 | 0 |
| 0.8027777777777777 | 0 |
| 0.8034722222222223 | 0 |
| 0.8041666666666667 | 0 |
| 0.8048611111111111 | 0 |
| 0.8055555555555555 | 0 |
| 0.80625 | 0 |
| 0.8069444444444445 | 0 |
| 0.8076388888888889 | 0 |
| 0.8083333333333332 | 0 |
| 0.8090277777777778 | 0 |
| 0.8097222222222222 | 0 |
| 0.8104166666666667 | 0 |
| 0.811111111111111 | 0 |
| 0.8118055555555556 | 0 |
| 0.8125 | 0 |
| 0.8131944444444444 | 0 |
| 0.813888888888889 | 0 |
| 0.8145833333333333 | 0 |
| 0.8152777777777778 | 0 |
| 0.8159722222222222 | 0 |
| 0.8166666666666668 | 0 |
| 0.8173611111111111 | 0 |
| 0.8180555555555555 | 0 |
| 0.81875 | 0 |
| 0.8194444444444445 | 0 |
| 0.8201388888888889 | 0 |
| 0.8208333333333333 | 0 |
| 0.8215277777777777 | 0 |
| 0.8222222222222223 | 0 |
| 0.8229166666666666 | 0 |
| 0.8236111111111111 | 0 |
| 0.8243055555555556 | 0 |
| 0.8250000000000001 | 0 |
| 0.8256944444444444 | 0 |
| 0.8263888888888888 | 0 |
| 0.8270833333333334 | 0 |
| 0.8277777777777778 | 0 |
| 0.8284722222222222 | 0 |
| 0.8291666666666666 | 0 |
| 0.8298611111111112 | 0 |
| 0.8305555555555556 | 0 |
| 0.8312499999999999 | 0 |
| 0.8319444444444444 | 0 |
| 0.8326388888888889 | 0 |
| 0.8333333333333334 | 0 |
| 0.8340277777777777 | 0 |
| 0.8347222222222223 | 0 |
| 0.8354166666666667 | 0 |
| 0.8361111111111111 | 0 |
| 0.8368055555555555 | 0 |
| 0.8375 | 0 |
| 0.8381944444444445 | 0 |
| 0.8388888888888889 | 0 |
| 0.8395833333333332 | 0 |
| 0.8402777777777778 | 0 |
| 0.8409722222222222 | 0 |
| 0.8416666666666667 | 0 |
| 0.842361111111111 | 0 |
| 0.8430555555555556 | 0 |
| 0.84375 | 0 |
| 0.8444444444444444 | 0 |
| 0.845138888888889 | 0 |
| 0.8458333333333333 | 0 |
| 0.8465277777777778 | 0 |
| 0.8472222222222222 | 0 |
| 0.8479166666666668 | 0 |
| 0.8486111111111111 | 0 |
| 0.8493055555555555 | 0 |
| 0.85 | 0 |
| 0.8506944444444445 | 0 |
| 0.8513888888888889 | 0 |
| 0.8520833333333333 | 0 |
| 0.8527777777777777 | 0 |
| 0.8534722222222223 | 0 |
| 0.8541666666666666 | 0 |
| 0.8548611111111111 | 0 |
| 0.8555555555555556 | 0 |
| 0.8562500000000001 | 0 |
| 0.8569444444444444 | 0 |
| 0.8576388888888888 | 0 |
| 0.8583333333333334 | 0 |
| 0.8590277777777778 | 0 |
| 0.8597222222222222 | 0 |
| 0.8604166666666666 | 0 |
| 0.8611111111111112 | 0 |
| 0.8618055555555556 | 0 |
| 0.8624999999999999 | 0 |
| 0.8631944444444444 | 0 |
| 0.8638888888888889 | 0 |
| 0.8645833333333334 | 0 |
| 0.8652777777777777 | 0 |
| 0.8659722222222223 | 0 |
| 0.8666666666666667 | 0 |
| 0.8673611111111111 | 0 |
| 0.8680555555555555 | 0 |
| 0.86875 | 0 |
| 0.8694444444444445 | 0 |
| 0.8701388888888889 | 0 |
| 0.8708333333333332 | 0 |
| 0.8715277777777778 | 0 |
| 0.8722222222222222 | 0 |
| 0.8729166666666667 | 0 |
| 0.873611111111111 | 0 |
| 0.8743055555555556 | 0 |
| 0.875 | 0 |
| 0.8756944444444444 | 0 |
| 0.876388888888889 | 0 |
| 0.8770833333333333 | 0 |
| 0.8777777777777778 | 0 |
| 0.8784722222222222 | 0 |
| 0.8791666666666668 | 0 |
| 0.8798611111111111 | 0 |
| 0.8805555555555555 | 0 |
| 0.88125 | 0 |
| 0.8819444444444445 | 0 |
| 0.8826388888888889 | 0 |
| 0.8833333333333333 | 0 |
| 0.8840277777777777 | 0 |
| 0.8847222222222223 | 0 |
| 0.8854166666666666 | 0 |
| 0.8861111111111111 | 0 |
| 0.8868055555555556 | 0 |
| 0.8875000000000001 | 0 |
| 0.8881944444444444 | 0 |
| 0.8888888888888888 | 0 |
| 0.8895833333333334 | 0 |
| 0.8902777777777778 | 0 |
| 0.8909722222222222 | 0 |
| 0.8916666666666666 | 0 |
| 0.8923611111111112 | 0 |
| 0.8930555555555556 | 0 |
| 0.8937499999999999 | 0 |
| 0.8944444444444444 | 0 |
| 0.8951388888888889 | 0 |
| 0.8958333333333334 | 0 |
| 0.8965277777777777 | 0 |
| 0.8972222222222223 | 0 |
| 0.8979166666666667 | 0 |
| 0.8986111111111111 | 0 |
| 0.8993055555555555 | 0 |
| 0.9 | 0 |
| 0.9006944444444445 | 0 |
| 0.9013888888888889 | 0 |
| 0.9020833333333332 | 0 |
| 0.9027777777777778 | 0 |
| 0.9034722222222222 | 0 |
| 0.9041666666666667 | 0 |
| 0.904861111111111 | 0 |
| 0.9055555555555556 | 0 |
| 0.90625 | 0 |
| 0.9069444444444444 | 0 |
| 0.907638888888889 | 0 |
| 0.9083333333333333 | 0 |
| 0.9090277777777778 | 0 |
| 0.9097222222222222 | 0 |
| 0.9104166666666668 | 0 |
| 0.9111111111111111 | 0 |
| 0.9118055555555555 | 0 |
| 0.9125 | 0 |
| 0.9131944444444445 | 0 |
| 0.9138888888888889 | 0 |
| 0.9145833333333333 | 0 |
| 0.9152777777777777 | 0 |
| 0.9159722222222223 | 0 |
| 0.9166666666666666 | 0 |
| 0.9173611111111111 | 0 |
| 0.9180555555555556 | 0 |
| 0.9187500000000001 | 0 |
| 0.9194444444444444 | 0 |
| 0.9201388888888888 | 0 |
| 0.9208333333333334 | 0 |
| 0.9215277777777778 | 0 |
| 0.9222222222222222 | 0 |
| 0.9229166666666666 | 0 |
| 0.9236111111111112 | 0 |
| 0.9243055555555556 | 0 |
| 0.9249999999999999 | 0 |
| 0.9256944444444444 | 0 |
| 0.9263888888888889 | 0 |
| 0.9270833333333334 | 0 |
| 0.9277777777777777 | 0 |
| 0.9284722222222223 | 0 |
| 0.9291666666666667 | 0 |
| 0.9298611111111111 | 0 |
| 0.9305555555555555 | 0 |
| 0.93125 | 0 |
| 0.9319444444444445 | 0 |
| 0.9326388888888889 | 0 |
| 0.9333333333333332 | 0 |
| 0.9340277777777778 | 0 |
| 0.9347222222222222 | 0 |
| 0.9354166666666667 | 0 |
| 0.936111111111111 | 0 |
| 0.9368055555555556 | 0 |
| 0.9375 | 0 |
| 0.9381944444444444 | 0 |
| 0.938888888888889 | 0 |
| 0.9395833333333333 | 0 |
| 0.9402777777777778 | 0 |
| 0.9409722222222222 | 0 |
| 0.9416666666666668 | 0 |
| 0.9423611111111111 | 0 |
| 0.9430555555555555 | 0 |
| 0.94375 | 0 |
| 0.9444444444444445 | 0 |
| 0.9451388888888889 | 0 |
| 0.9458333333333333 | 0 |
| 0.9465277777777777 | 0 |
| 0.9472222222222223 | 0 |
| 0.9479166666666666 | 0 |
| 0.9486111111111111 | 0 |
| 0.9493055555555556 | 0 |
| 0.9500000000000001 | 0 |
| 0.9506944444444444 | 0 |
| 0.9513888888888888 | 0 |
| 0.9520833333333334 | 0 |
| 0.9527777777777778 | 0 |
| 0.9534722222222222 | 0 |
| 0.9541666666666666 | 0 |
| 0.9548611111111112 | 0 |
| 0.9555555555555556 | 0 |
| 0.9562499999999999 | 0 |
| 0.9569444444444444 | 0 |
| 0.9576388888888889 | 0 |
| 0.9583333333333334 | 0 |
| 0.9590277777777777 | 0 |
| 0.9597222222222223 | 0 |
| 0.9604166666666667 | 0 |
| 0.9611111111111111 | 0 |
| 0.9618055555555555 | 0 |
| 0.9625 | 0 |
| 0.9631944444444445 | 0 |
| 0.9638888888888889 | 0 |
| 0.9645833333333332 | 0 |
| 0.9652777777777778 | 0 |
| 0.9659722222222222 | 0 |
| 0.9666666666666667 | 0 |
| 0.967361111111111 | 0 |
| 0.9680555555555556 | 0 |
| 0.96875 | 0 |
| 0.9694444444444444 | 0 |
| 0.970138888888889 | 0 |
| 0.9708333333333333 | 0 |
| 0.9715277777777778 | 0 |
| 0.9722222222222222 | 0 |
| 0.9729166666666668 | 0 |
| 0.9736111111111111 | 0 |
| 0.9743055555555555 | 0 |
| 0.975 | 0 |
| 0.9756944444444445 | 0 |
| 0.9763888888888889 | 0 |
| 0.9770833333333333 | 0 |
| 0.9777777777777777 | 0 |
| 0.9784722222222223 | 0 |
| 0.9791666666666666 | 0 |
| 0.9798611111111111 | 0 |
| 0.9805555555555556 | 0 |
| 0.9812500000000001 | 0 |
| 0.9819444444444444 | 0 |
| 0.9826388888888888 | 0 |
| 0.9833333333333334 | 0 |
| 0.9840277777777778 | 0 |
| 0.9847222222222222 | 0 |
| 0.9854166666666666 | 0 |
| 0.9861111111111112 | 0 |
| 0.9868055555555556 | 0 |
| 0.9874999999999999 | 0 |
| 0.9881944444444444 | 0 |
| 0.9888888888888889 | 0 |
| 0.9895833333333334 | 0 |
| 0.9902777777777777 | 0 |
| 0.9909722222222223 | 0 |
| 0.9916666666666667 | 0 |
| 0.9923611111111111 | 0 |
| 0.9930555555555555 | 0 |
| 0.99375 | 0 |
| 0.9944444444444445 | 0 |
| 0.9951388888888889 | 0 |
| 0.9958333333333332 | 0 |
| 0.9965277777777778 | 0 |
| 0.9972222222222222 | 0 |
| 0.9979166666666667 | 0 |
| 0.998611111111111 | 0 |
| 0.9993055555555556 | 0 |